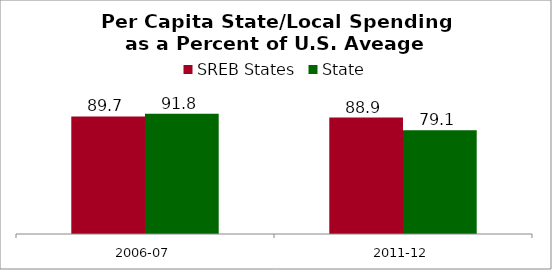
| Category | SREB States | State |
|---|---|---|
| 2006-07 | 89.702 | 91.758 |
| 2011-12 | 88.908 | 79.15 |